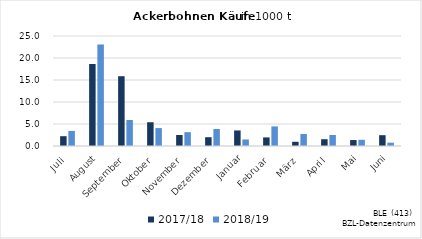
| Category | 2017/18 | 2018/19 |
|---|---|---|
| Juli | 2.23 | 3.421 |
| August | 18.638 | 23.076 |
| September | 15.862 | 5.908 |
| Oktober | 5.402 | 4.076 |
| November | 2.507 | 3.143 |
| Dezember | 2 | 3.861 |
| Januar | 3.534 | 1.485 |
| Februar | 1.953 | 4.451 |
| März | 0.959 | 2.724 |
| April | 1.541 | 2.501 |
| Mai | 1.355 | 1.41 |
| Juni | 2.458 | 0.758 |